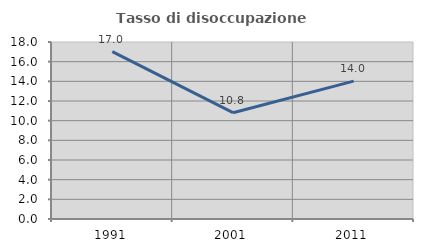
| Category | Tasso di disoccupazione giovanile  |
|---|---|
| 1991.0 | 17.021 |
| 2001.0 | 10.811 |
| 2011.0 | 14.019 |